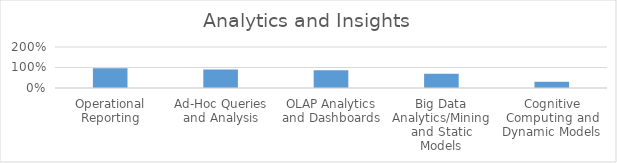
| Category | Series 0 |
|---|---|
| Operational Reporting | 0.967 |
| Ad-Hoc Queries and Analysis | 0.9 |
| OLAP Analytics and Dashboards | 0.867 |
| Big Data Analytics/Mining and Static Models | 0.7 |
| Cognitive Computing and Dynamic Models | 0.3 |